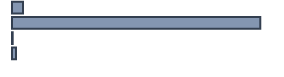
| Category | Series 0 |
|---|---|
| 0 | 4.21 |
| 1 | 94.046 |
| 2 | 0.259 |
| 3 | 1.485 |